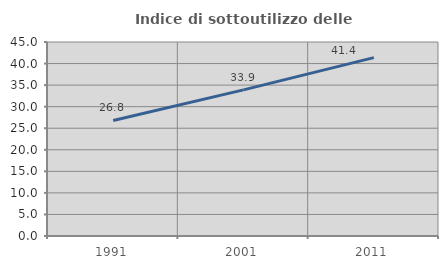
| Category | Indice di sottoutilizzo delle abitazioni  |
|---|---|
| 1991.0 | 26.794 |
| 2001.0 | 33.892 |
| 2011.0 | 41.379 |